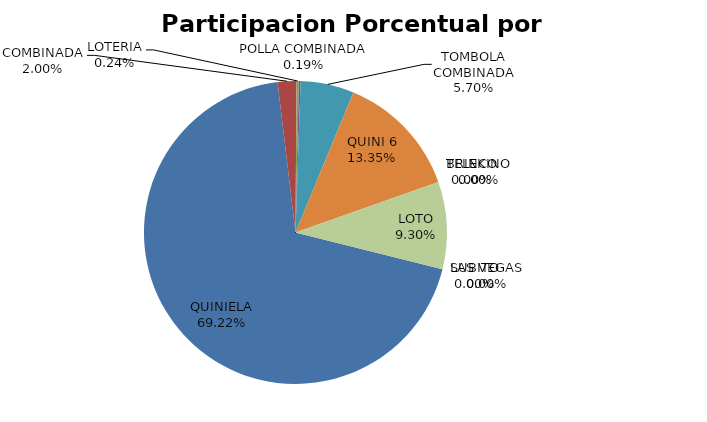
| Category | Series 0 |
|---|---|
| QUINIELA | 2063709 |
| COMBINADA | 59572 |
| LOTERIA | 7288 |
| POLLA COMBINADA | 5544 |
| TOMBOLA COMBINADA | 169973 |
| QUINI 6 | 397932 |
| TELEKINO | 0 |
| BRINCO | 0 |
| LOTO | 277281 |
| SUBITO | 0 |
| LAS VEGAS | 0 |